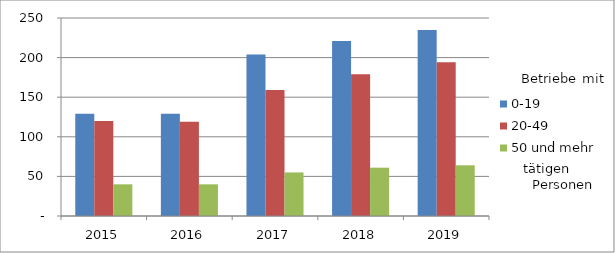
| Category | 0-19 | 20-49 | 50 und mehr |
|---|---|---|---|
| 2015.0 | 129 | 120 | 40 |
| 2016.0 | 129 | 119 | 40 |
| 2017.0 | 204 | 159 | 55 |
| 2018.0 | 221 | 179 | 61 |
| 2019.0 | 235 | 194 | 64 |